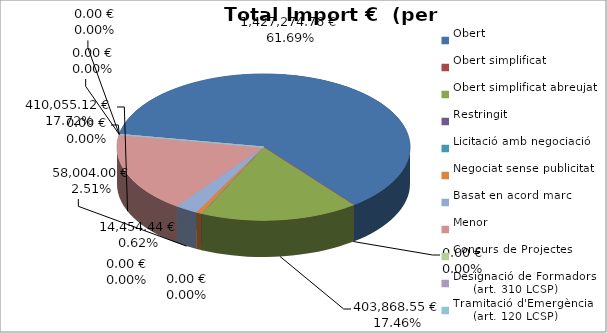
| Category | Total preu
(amb IVA) |
|---|---|
| Obert | 1427274.76 |
| Obert simplificat | 0 |
| Obert simplificat abreujat | 403868.55 |
| Restringit | 0 |
| Licitació amb negociació | 0 |
| Negociat sense publicitat | 14454.44 |
| Basat en acord marc | 58004 |
| Menor | 410055.12 |
| Concurs de Projectes | 0 |
| Designació de Formadors
     (art. 310 LCSP) | 0 |
| Tramitació d'Emergència
     (art. 120 LCSP) | 0 |